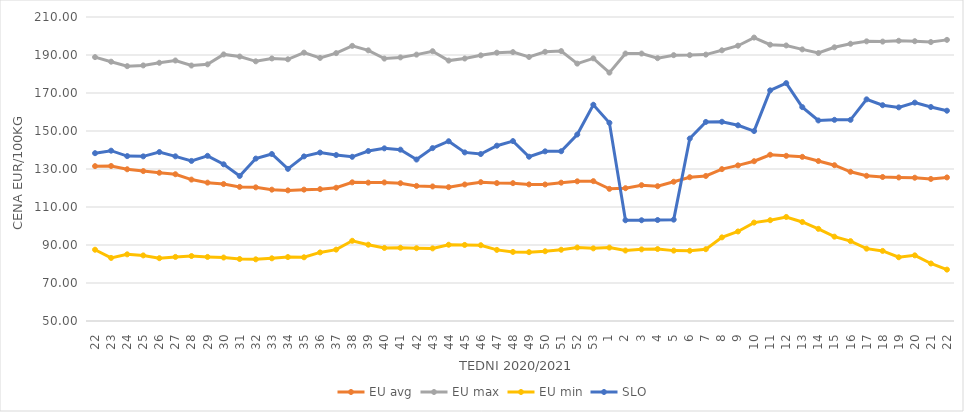
| Category | EU avg | EU max | EU min | SLO |
|---|---|---|---|---|
| 22.0 | 131.509 | 188.89 | 87.513 | 138.33 |
| 23.0 | 131.578 | 186.47 | 83.199 | 139.64 |
| 24.0 | 129.861 | 184.13 | 85.09 | 136.79 |
| 25.0 | 128.899 | 184.51 | 84.52 | 136.65 |
| 26.0 | 128.034 | 185.91 | 83.06 | 138.92 |
| 27.0 | 127.242 | 187.11 | 83.73 | 136.67 |
| 28.0 | 124.426 | 184.46 | 84.2 | 134.25 |
| 29.0 | 122.822 | 185.09 | 83.72 | 136.94 |
| 30.0 | 122.086 | 190.31 | 83.4 | 132.48 |
| 31.0 | 120.581 | 189.19 | 82.63 | 126.34 |
| 32.0 | 120.341 | 186.67 | 82.46 | 135.48 |
| 33.0 | 119.127 | 188.18 | 82.99 | 137.89 |
| 34.0 | 118.75 | 187.74 | 83.66 | 130.07 |
| 35.0 | 119.136 | 191.25 | 83.53 | 136.63 |
| 36.0 | 119.398 | 188.47 | 86.09 | 138.64 |
| 37.0 | 120.135 | 190.99 | 87.57 | 137.35 |
| 38.0 | 122.982 | 194.8 | 92.21 | 136.42 |
| 39.0 | 122.832 | 192.45 | 90.16 | 139.46 |
| 40.0 | 122.936 | 188.11 | 88.45 | 140.87 |
| 41.0 | 122.507 | 188.73 | 88.54 | 140.18 |
| 42.0 | 121.098 | 190.2 | 88.3 | 134.98 |
| 43.0 | 120.822 | 191.99 | 88.22 | 141 |
| 44.0 | 120.448 | 187.06 | 90.13 | 144.61 |
| 45.0 | 121.843 | 188.15 | 90.04 | 138.73 |
| 46.0 | 123.07 | 189.82 | 89.89 | 137.88 |
| 47.0 | 122.58 | 191.22 | 87.43 | 142.27 |
| 48.0 | 122.553 | 191.52 | 86.35 | 144.69 |
| 49.0 | 121.893 | 188.97 | 86.24 | 136.47 |
| 50.0 | 121.851 | 191.67 | 86.72 | 139.29 |
| 51.0 | 122.8 | 192.06 | 87.5 | 139.35 |
| 52.0 | 123.52 | 185.468 | 88.67 | 148.16 |
| 53.0 | 123.611 | 188.25 | 88.23 | 163.81 |
| 1.0 | 119.553 | 180.72 | 88.64 | 154.31 |
| 2.0 | 119.893 | 190.77 | 87.1 | 103.02 |
| 3.0 | 121.489 | 190.76 | 87.7 | 103.03 |
| 4.0 | 120.954 | 188.33 | 87.88 | 103.15 |
| 5.0 | 123.293 | 189.91 | 87.04 | 103.34 |
| 6.0 | 125.679 | 189.94 | 86.97 | 146.03 |
| 7.0 | 126.33 | 190.21 | 87.79 | 154.77 |
| 8.0 | 129.933 | 192.48 | 94.02 | 154.86 |
| 9.0 | 131.908 | 194.884 | 97.12 | 153 |
| 10.0 | 134.098 | 199.17 | 101.79 | 149.98 |
| 11.0 | 137.49 | 195.419 | 103.05 | 171.4 |
| 12.0 | 136.929 | 195.013 | 104.76 | 175.2 |
| 13.0 | 136.39 | 192.952 | 102.11 | 162.57 |
| 14.0 | 134.198 | 191.034 | 98.5 | 155.55 |
| 15.0 | 132.003 | 194.047 | 94.39 | 155.88 |
| 16.0 | 128.53 | 195.913 | 92.04 | 155.88 |
| 17.0 | 126.415 | 197.188 | 88.07 | 166.66 |
| 18.0 | 125.787 | 197.055 | 86.89 | 163.58 |
| 19.0 | 125.54 | 197.478 | 83.546 | 162.44 |
| 20.0 | 125.412 | 197.263 | 84.55 | 164.94 |
| 21.0 | 124.768 | 196.821 | 80.264 | 162.64 |
| 22.0 | 125.568 | 197.963 | 77.048 | 160.68 |